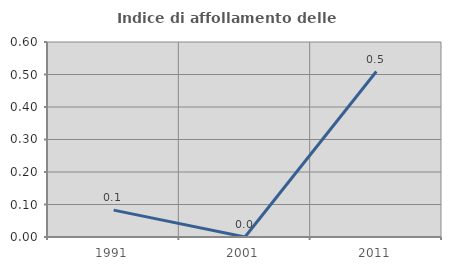
| Category | Indice di affollamento delle abitazioni  |
|---|---|
| 1991.0 | 0.083 |
| 2001.0 | 0 |
| 2011.0 | 0.509 |